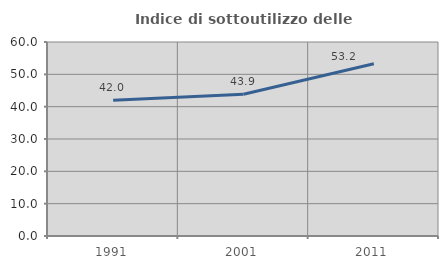
| Category | Indice di sottoutilizzo delle abitazioni  |
|---|---|
| 1991.0 | 42.003 |
| 2001.0 | 43.854 |
| 2011.0 | 53.249 |